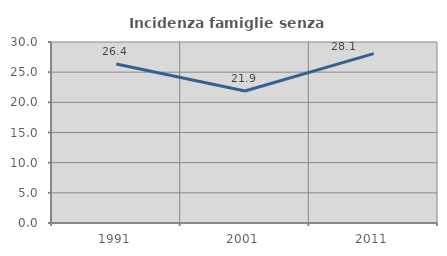
| Category | Incidenza famiglie senza nuclei |
|---|---|
| 1991.0 | 26.359 |
| 2001.0 | 21.872 |
| 2011.0 | 28.065 |